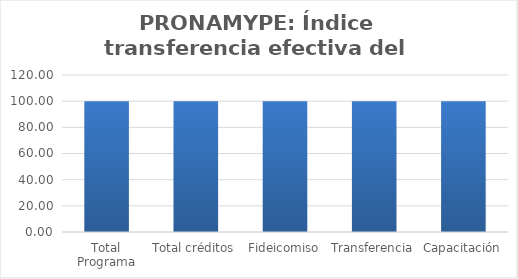
| Category | Índice transferencia efectiva del gasto (ITG) |
|---|---|
| Total Programa | 100 |
| Total créditos | 100 |
| Fideicomiso | 100 |
| Transferencia | 100 |
| Capacitación | 100 |